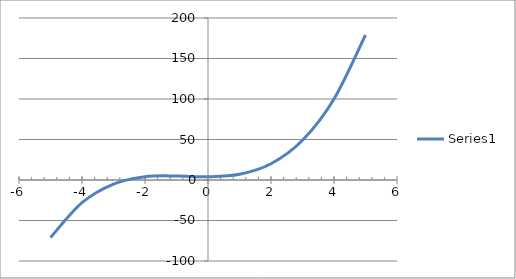
| Category | Series 0 |
|---|---|
| -5.0 | -71 |
| -4.0 | -28 |
| -3.0 | -5 |
| -2.0 | 4 |
| -1.0 | 5 |
| 0.0 | 4 |
| 1.0 | 7 |
| 2.0 | 20 |
| 3.0 | 49 |
| 4.0 | 100 |
| 5.0 | 179 |